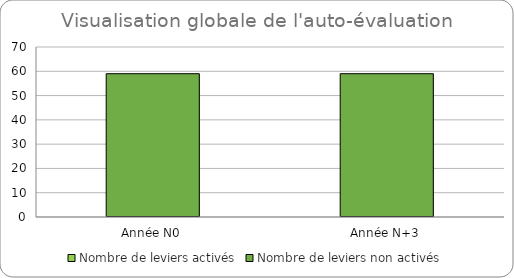
| Category | Nombre de leviers activés | Nombre de leviers non activés |
|---|---|---|
| Année N0 | 0 | 59 |
| Année N+3 | 0 | 59 |